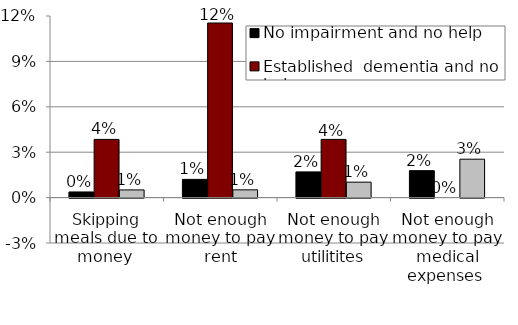
| Category | No impairment and no help | Established  dementia and no help  | Established dementia and help  |
|---|---|---|---|
| Skipping meals due to money  | 0.004 | 0.038 | 0.005 |
| Not enough money to pay rent | 0.012 | 0.115 | 0.005 |
| Not enough money to pay utilitites | 0.017 | 0.038 | 0.01 |
| Not enough money to pay medical expenses  | 0.018 | 0 | 0.025 |